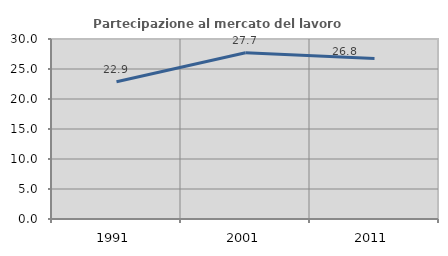
| Category | Partecipazione al mercato del lavoro  femminile |
|---|---|
| 1991.0 | 22.869 |
| 2001.0 | 27.711 |
| 2011.0 | 26.761 |